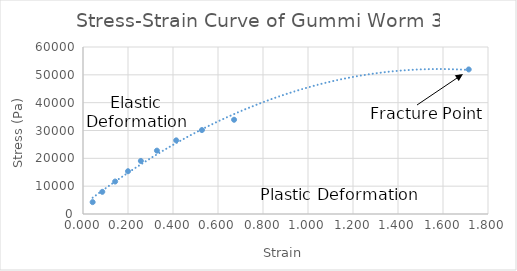
| Category | Series 0 |
|---|---|
| 0.04285714285714269 | 4265.421 |
| 0.08571428571428559 | 7964.836 |
| 0.14285714285714277 | 11664.251 |
| 0.19999999999999996 | 15363.665 |
| 0.25714285714285695 | 19063.08 |
| 0.32857142857142846 | 22762.495 |
| 0.4142857142857142 | 26461.91 |
| 0.5285714285714284 | 30161.325 |
| 0.6714285714285714 | 33860.74 |
| 1.714285714285714 | 51937.838 |